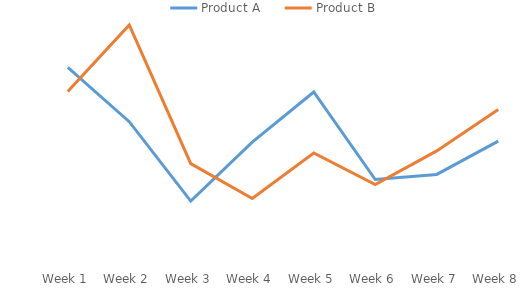
| Category | Product A | Product B |
|---|---|---|
| 1.0 | 382 | 335 |
| 2.0 | 276 | 465 |
| 3.0 | 121 | 194 |
| 4.0 | 236 | 126 |
| 5.0 | 334 | 215 |
| 6.0 | 163 | 153 |
| 7.0 | 173 | 219 |
| 8.0 | 238 | 300 |